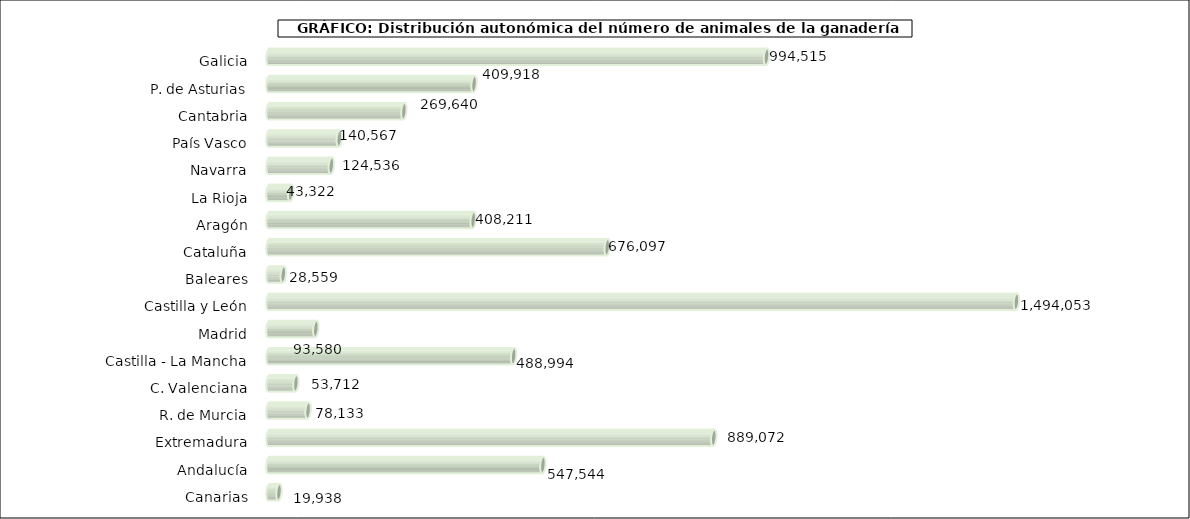
| Category | num. Animales |
|---|---|
|   Galicia | 994515 |
|   P. de Asturias | 409918 |
|   Cantabria | 269640 |
|   País Vasco | 140567 |
|   Navarra | 124536 |
|   La Rioja | 43322 |
|   Aragón | 408211 |
|   Cataluña | 676097 |
|   Baleares | 28559 |
|   Castilla y León | 1494053 |
|   Madrid | 93580 |
|   Castilla - La Mancha | 488994 |
|   C. Valenciana | 53712 |
|   R. de Murcia | 78133 |
|   Extremadura | 889072 |
|   Andalucía | 547544 |
|   Canarias | 19938 |